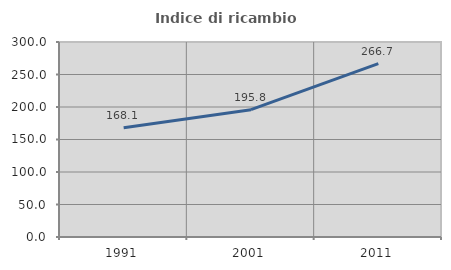
| Category | Indice di ricambio occupazionale  |
|---|---|
| 1991.0 | 168.056 |
| 2001.0 | 195.833 |
| 2011.0 | 266.667 |